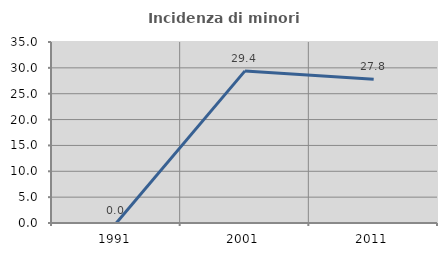
| Category | Incidenza di minori stranieri |
|---|---|
| 1991.0 | 0 |
| 2001.0 | 29.412 |
| 2011.0 | 27.778 |